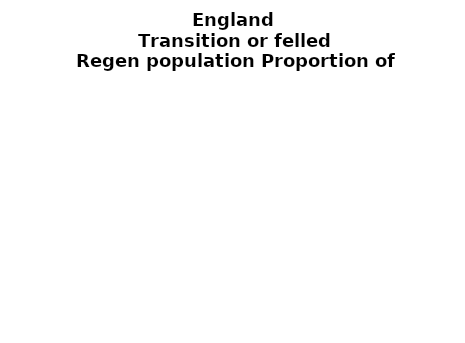
| Category | Transition or felled |
|---|---|
| None | 0.096 |
| Seedlings only | 0 |
| Seedlings, saplings only | 0.14 |
| Seedlings, saplings, <7 cm trees | 0.155 |
| Saplings only | 0.256 |
| <7 cm trees, seedlings only | 0 |
| <7 cm trees, saplings only | 0.314 |
| <7 cm Trees only | 0.039 |